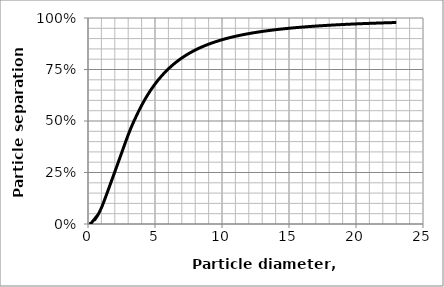
| Category | eff |
|---|---|
| 0.1 | 0.001 |
| 0.25 | 0.005 |
| 0.75 | 0.046 |
| 0.5 | 0.021 |
| 1.0 | 0.078 |
| 2.0 | 0.253 |
| 3.0 | 0.433 |
| 3.5 | 0.509 |
| 4.0 | 0.576 |
| 4.5 | 0.632 |
| 5.0 | 0.679 |
| 5.5 | 0.719 |
| 6.0 | 0.753 |
| 6.5 | 0.782 |
| 7.0 | 0.806 |
| 7.5 | 0.827 |
| 8.0 | 0.844 |
| 8.5 | 0.86 |
| 9.0 | 0.873 |
| 9.5 | 0.884 |
| 10.0 | 0.894 |
| 10.5 | 0.903 |
| 11.0 | 0.911 |
| 11.5 | 0.918 |
| 12.0 | 0.924 |
| 12.5 | 0.93 |
| 13.0 | 0.935 |
| 13.5 | 0.939 |
| 14.0 | 0.943 |
| 14.5 | 0.947 |
| 15.0 | 0.95 |
| 15.5 | 0.953 |
| 16.0 | 0.956 |
| 16.5 | 0.958 |
| 17.0 | 0.961 |
| 17.5 | 0.963 |
| 18.0 | 0.965 |
| 18.5 | 0.967 |
| 19.0 | 0.968 |
| 19.5 | 0.97 |
| 20.0 | 0.971 |
| 20.5 | 0.973 |
| 21.0 | 0.974 |
| 21.5 | 0.975 |
| 22.0 | 0.976 |
| 22.5 | 0.977 |
| 23.0 | 0.978 |